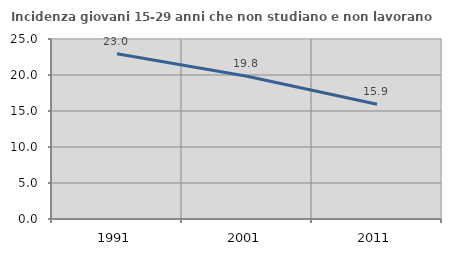
| Category | Incidenza giovani 15-29 anni che non studiano e non lavorano  |
|---|---|
| 1991.0 | 22.961 |
| 2001.0 | 19.815 |
| 2011.0 | 15.938 |